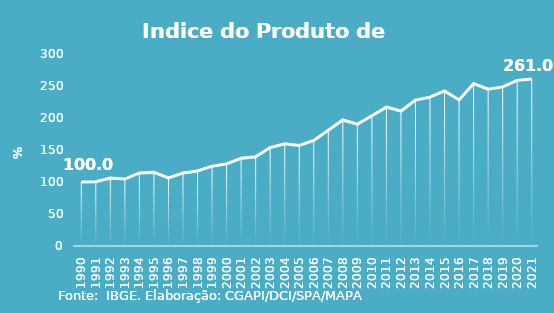
| Category | Indice de Prod. base 1990 |
|---|---|
| 1990.0 | 100 |
| 1991.0 | 100.275 |
| 1992.0 | 106.203 |
| 1993.0 | 104.57 |
| 1994.0 | 114.164 |
| 1995.0 | 115.024 |
| 1996.0 | 106.552 |
| 1997.0 | 114.037 |
| 1998.0 | 117.319 |
| 1999.0 | 124.734 |
| 2000.0 | 128.293 |
| 2001.0 | 136.975 |
| 2002.0 | 139.51 |
| 2003.0 | 153.868 |
| 2004.0 | 159.641 |
| 2005.0 | 157.136 |
| 2006.0 | 164.858 |
| 2007.0 | 180.781 |
| 2008.0 | 196.91 |
| 2009.0 | 190.309 |
| 2010.0 | 203.581 |
| 2011.0 | 217.041 |
| 2012.0 | 210.932 |
| 2013.0 | 228.009 |
| 2014.0 | 232.562 |
| 2015.0 | 242.318 |
| 2016.0 | 228.239 |
| 2017.0 | 253.826 |
| 2018.0 | 245.134 |
| 2019.0 | 248.619 |
| 2020.0 | 258.817 |
| 2021.0 | 260.953 |